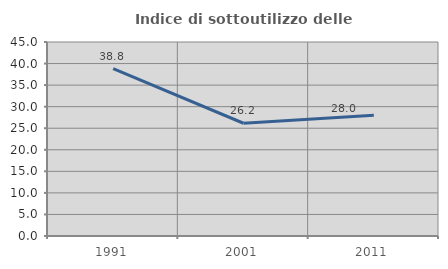
| Category | Indice di sottoutilizzo delle abitazioni  |
|---|---|
| 1991.0 | 38.806 |
| 2001.0 | 26.154 |
| 2011.0 | 28 |